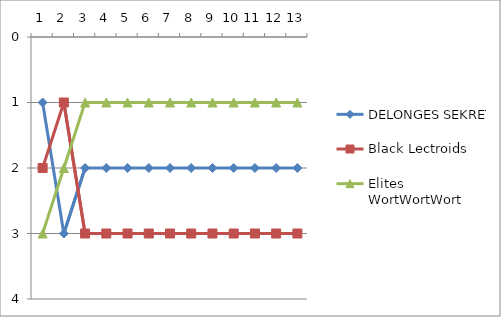
| Category | DELONGES SEKRET | Black Lectroids | Elites WortWortWort |
|---|---|---|---|
| 0 | 1 | 2 | 3 |
| 1 | 3 | 1 | 2 |
| 2 | 2 | 3 | 1 |
| 3 | 2 | 3 | 1 |
| 4 | 2 | 3 | 1 |
| 5 | 2 | 3 | 1 |
| 6 | 2 | 3 | 1 |
| 7 | 2 | 3 | 1 |
| 8 | 2 | 3 | 1 |
| 9 | 2 | 3 | 1 |
| 10 | 2 | 3 | 1 |
| 11 | 2 | 3 | 1 |
| 12 | 2 | 3 | 1 |